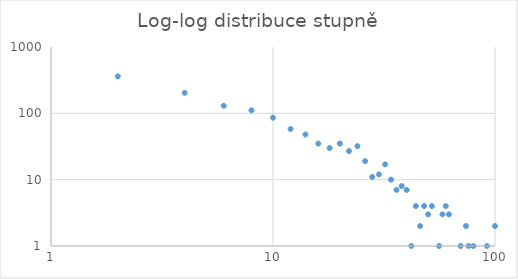
| Category | Series 0 |
|---|---|
| 0.3010299956639812 | 2.558 |
| 0.6020599913279624 | 2.31 |
| 0.7781512503836436 | 2.114 |
| 0.9030899869919435 | 2.045 |
| 1.0 | 1.934 |
| 1.0791812460476249 | 1.763 |
| 1.146128035678238 | 1.681 |
| 1.2041199826559248 | 1.544 |
| 1.255272505103306 | 1.477 |
| 1.3010299956639813 | 1.544 |
| 1.3424226808222062 | 1.431 |
| 1.380211241711606 | 1.505 |
| 1.414973347970818 | 1.279 |
| 1.4471580313422192 | 1.041 |
| 1.4771212547196624 | 1.079 |
| 1.505149978319906 | 1.23 |
| 1.5314789170422551 | 1 |
| 1.5563025007672873 | 0.845 |
| 1.5797835966168101 | 0.903 |
| 1.6020599913279623 | 0.845 |
| 1.6232492903979006 | 0 |
| 1.6434526764861874 | 0.602 |
| 1.662757831681574 | 0.301 |
| 1.6812412373755872 | 0.602 |
| 1.6989700043360187 | 0.477 |
| 1.7160033436347992 | 0.602 |
| 1.7323937598229686 | 0 |
| 1.7481880270062005 | 0 |
| 1.7634279935629373 | 0.477 |
| 1.7781512503836436 | 0.602 |
| 1.792391689498254 | 0.477 |
| 1.806179973983887 | 0 |
| 1.8195439355418688 | 0 |
| 1.8325089127062364 | 0 |
| 1.845098040014257 | 0 |
| 1.8573324964312685 | 0 |
| 1.8692317197309762 | 0.301 |
| 1.8808135922807914 | 0 |
| 1.8920946026904804 | 0 |
| 1.9030899869919435 | 0 |
| 1.9138138523837167 | 0 |
| 1.9242792860618816 | 0 |
| 1.9344984512435677 | 0 |
| 1.9444826721501687 | 0 |
| 1.954242509439325 | 0 |
| 1.9637878273455553 | 0 |
| 1.9731278535996986 | 0 |
| 1.9822712330395684 | 0 |
| 1.9912260756924949 | 0 |
| 2.0 | 0.301 |